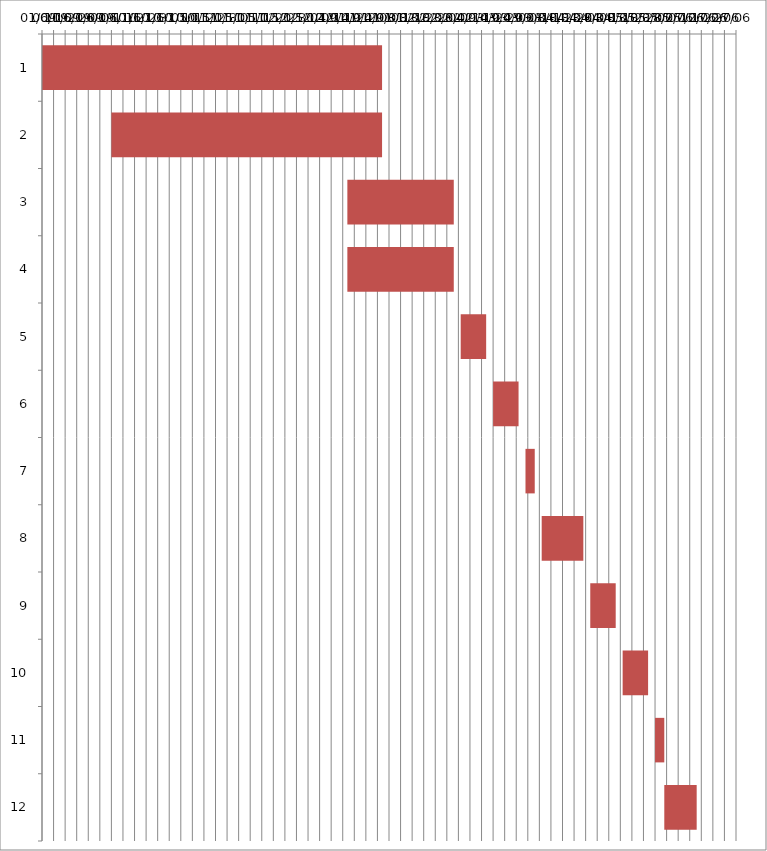
| Category | Fecha de inicio | DURACIÓN |
|---|---|---|
| 0 | 01/09/2015 | 147 |
| 1 | 01/10/2015 | 117 |
| 2 | 11/01/2016 | 46 |
| 3 | 11/01/2016 | 46 |
| 4 | 29/02/2016 | 11 |
| 5 | 14/03/2016 | 11 |
| 6 | 28/03/2016 | 4 |
| 7 | 04/04/2016 | 18 |
| 8 | 25/04/2016 | 11 |
| 9 | 09/05/2016 | 11 |
| 10 | 23/05/2016 | 4 |
| 11 | 27/05/2016 | 14 |